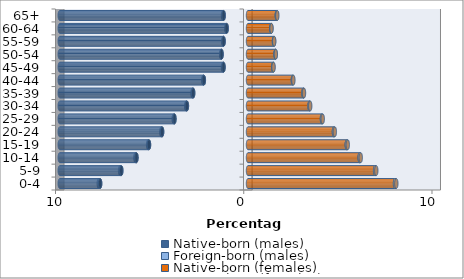
| Category | Native-born (males) | Foreign-born (males) | Native-born (females) | Foreign-born (females) |
|---|---|---|---|---|
| 0-4 | -7.855 | -0.072 | 7.81 | 0.069 |
| 5-9 | -6.732 | -0.063 | 6.753 | 0.063 |
| 10-14 | -5.926 | -0.055 | 5.93 | 0.059 |
| 15-19 | -5.259 | -0.046 | 5.247 | 0.053 |
| 20-24 | -4.563 | -0.043 | 4.564 | 0.05 |
| 25-29 | -3.908 | -0.039 | 3.928 | 0.043 |
| 30-34 | -3.245 | -0.039 | 3.267 | 0.037 |
| 35-39 | -2.913 | -0.036 | 2.944 | 0.031 |
| 40-44 | -2.345 | -0.033 | 2.384 | 0.026 |
| 45-49 | -1.301 | -0.027 | 1.336 | 0.021 |
| 50-54 | -1.404 | -0.022 | 1.46 | 0.017 |
| 55-59 | -1.296 | -0.017 | 1.38 | 0.013 |
| 60-64 | -1.133 | -0.013 | 1.238 | 0.01 |
| 65+ | -1.294 | -0.033 | 1.53 | 0.027 |